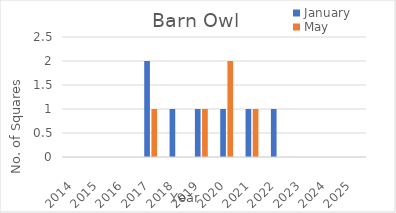
| Category | January | May |
|---|---|---|
| 2014.0 | 0 | 0 |
| 2015.0 | 0 | 0 |
| 2016.0 | 0 | 0 |
| 2017.0 | 2 | 1 |
| 2018.0 | 1 | 0 |
| 2019.0 | 1 | 1 |
| 2020.0 | 1 | 2 |
| 2021.0 | 1 | 1 |
| 2022.0 | 1 | 0 |
| 2023.0 | 0 | 0 |
| 2024.0 | 0 | 0 |
| 2025.0 | 0 | 0 |